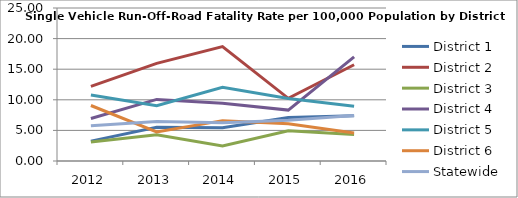
| Category | District 1 | District 2 | District 3 | District 4 | District 5 | District 6 | Statewide |
|---|---|---|---|---|---|---|---|
| 2012.0 | 3.249 | 12.206 | 3.097 | 6.946 | 10.795 | 9.068 | 5.765 |
| 2013.0 | 5.516 | 15.949 | 4.291 | 10.06 | 9.029 | 4.749 | 6.451 |
| 2014.0 | 5.42 | 18.686 | 2.442 | 9.449 | 12.031 | 6.596 | 6.241 |
| 2015.0 | 7.111 | 10.244 | 4.936 | 8.316 | 10.215 | 6.072 | 6.647 |
| 2016.0 | 7.389 | 15.73 | 4.313 | 17.015 | 8.939 | 4.583 | 7.426 |